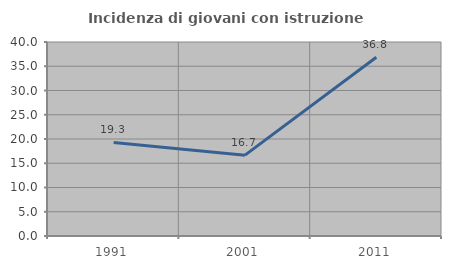
| Category | Incidenza di giovani con istruzione universitaria |
|---|---|
| 1991.0 | 19.298 |
| 2001.0 | 16.667 |
| 2011.0 | 36.842 |